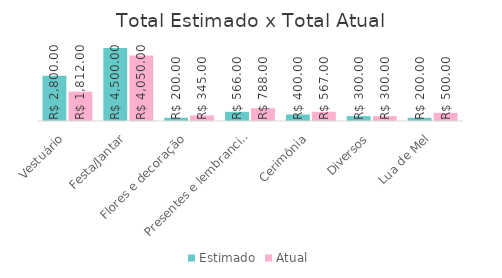
| Category | Estimado | Atual |
|---|---|---|
| Vestuário | 2800 | 1812 |
| Festa/Jantar | 4500 | 4050 |
| Flores e decoração | 200 | 345 |
| Presentes e lembrancinhas | 566 | 788 |
| Cerimônia | 400 | 567 |
| Diversos | 300 | 300 |
| Lua de Mel | 200 | 500 |